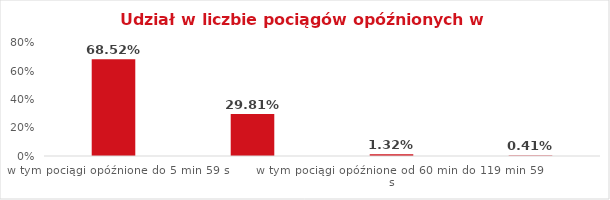
| Category | Series 0 |
|---|---|
| w tym pociągi opóźnione do 5 min 59 s | 0.685 |
| w tym pociągi opóźnione od 6 min do 59 min 59 s | 0.298 |
| w tym pociągi opóźnione od 60 min do 119 min 59 s | 0.013 |
| w tym pociągi opóźnione od 120 min | 0.004 |